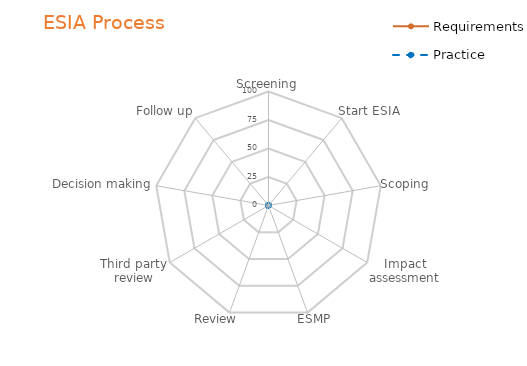
| Category | Requirements | Practice |
|---|---|---|
| Screening | 0 | 0 |
| Start ESIA | 0 | 0 |
| Scoping | 0 | 0 |
| Impact assessment | 0 | 0 |
| ESMP | 0 | 0 |
| Review | 0 | 0 |
| Third party review | 0 | 0 |
| Decision making | 0 | 0 |
| Follow up | 0 | 0 |